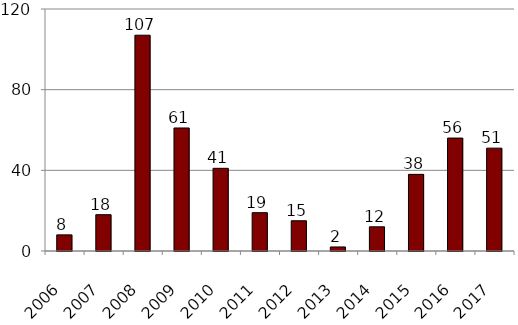
| Category | Series 0 |
|---|---|
| 2006.0 | 8 |
| 2007.0 | 18 |
| 2008.0 | 107 |
| 2009.0 | 61 |
| 2010.0 | 41 |
| 2011.0 | 19 |
| 2012.0 | 15 |
| 2013.0 | 2 |
| 2014.0 | 12 |
| 2015.0 | 38 |
| 2016.0 | 56 |
| 2017.0 | 51 |